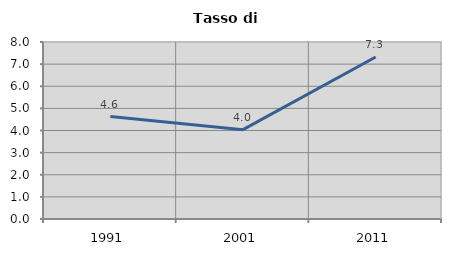
| Category | Tasso di disoccupazione   |
|---|---|
| 1991.0 | 4.631 |
| 2001.0 | 4.039 |
| 2011.0 | 7.321 |